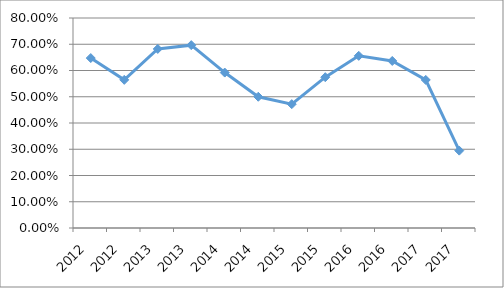
| Category | FOMA-N1O43 |
|---|---|
| 2012.0 | 0.647 |
| 2012.0 | 0.564 |
| 2013.0 | 0.682 |
| 2013.0 | 0.697 |
| 2014.0 | 0.592 |
| 2014.0 | 0.5 |
| 2015.0 | 0.472 |
| 2015.0 | 0.574 |
| 2016.0 | 0.656 |
| 2016.0 | 0.636 |
| 2017.0 | 0.564 |
| 2017.0 | 0.295 |